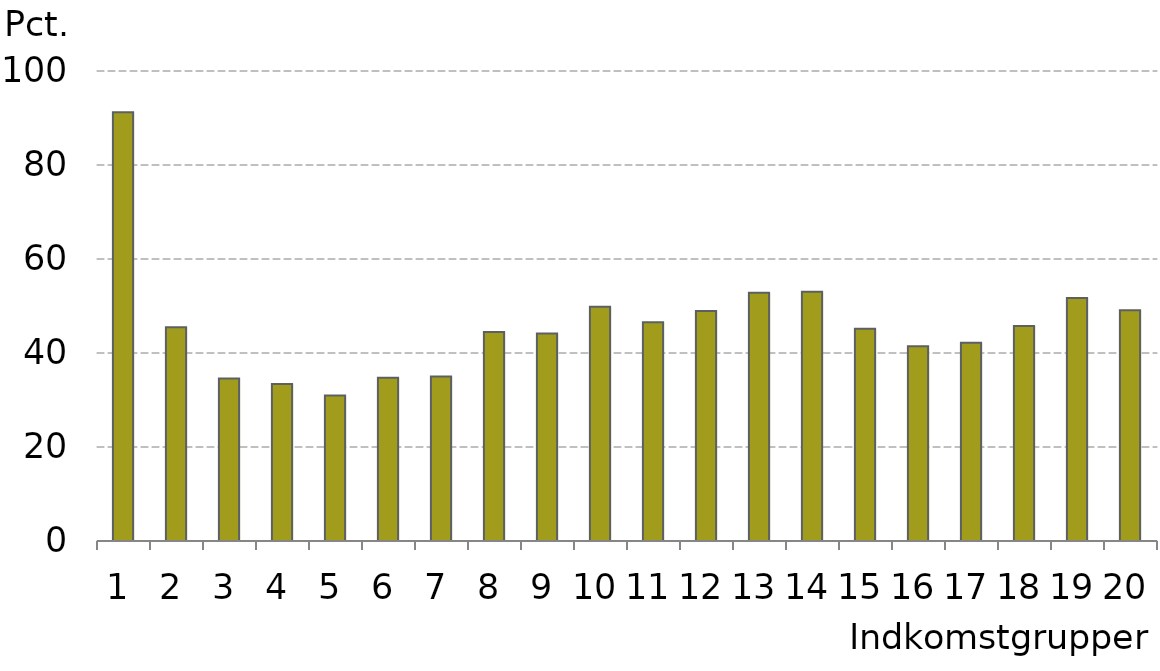
| Category |  Serie1 |
|---|---|
| 0 | 91.221 |
| 1 | 45.457 |
| 2 | 34.554 |
| 3 | 33.399 |
| 4 | 30.935 |
| 5 | 34.736 |
| 6 | 34.991 |
| 7 | 44.467 |
| 8 | 44.131 |
| 9 | 49.83 |
| 10 | 46.542 |
| 11 | 48.93 |
| 12 | 52.813 |
| 13 | 53.008 |
| 14 | 45.154 |
| 15 | 41.447 |
| 16 | 42.159 |
| 17 | 45.751 |
| 18 | 51.68 |
| 19 | 49.093 |